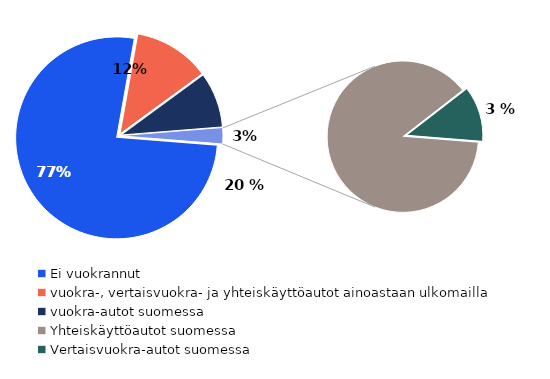
| Category | Series 0 |
|---|---|
| Ei vuokrannut | 0.765 |
| vuokra-, vertaisvuokra- ja yhteiskäyttöautot ainoastaan ulkomailla | 0.121 |
| vuokra-autot suomessa | 0.088 |
| Yhteiskäyttöautot suomessa | 0.022 |
| Vertaisvuokra-autot suomessa | 0.003 |